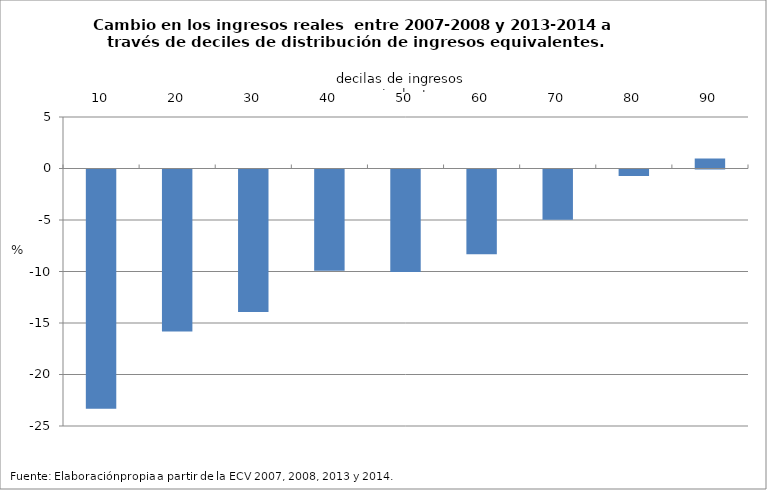
| Category | Cambio de ingresos reales |
|---|---|
| 10.0 | -23.231 |
| 20.0 | -15.72 |
| 30.0 | -13.823 |
| 40.0 | -9.839 |
| 50.0 | -9.95 |
| 60.0 | -8.217 |
| 70.0 | -4.887 |
| 80.0 | -0.632 |
| 90.0 | 0.971 |